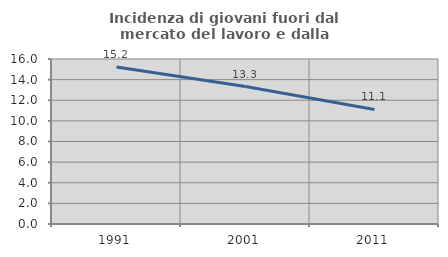
| Category | Incidenza di giovani fuori dal mercato del lavoro e dalla formazione  |
|---|---|
| 1991.0 | 15.217 |
| 2001.0 | 13.333 |
| 2011.0 | 11.111 |